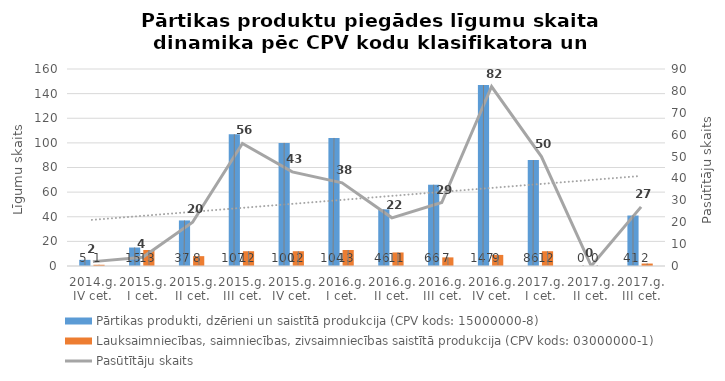
| Category | Pārtikas produkti, dzērieni un saistītā produkcija (CPV kods: 15000000-8) | Lauksaimniecības, saimniecības, zivsaimniecības saistītā produkcija (CPV kods: 03000000-1) |
|---|---|---|
| 2014.g. IV cet. | 5 | 1 |
| 2015.g. I cet. | 15 | 13 |
| 2015.g. II cet. | 37 | 8 |
| 2015.g. III cet. | 107 | 12 |
| 2015.g. IV cet. | 100 | 12 |
| 2016.g. I cet. | 104 | 13 |
| 2016.g. II cet. | 46 | 11 |
| 2016.g. III cet. | 66 | 7 |
| 2016.g. IV cet. | 147 | 9 |
| 2017.g. I cet. | 86 | 12 |
| 2017.g. II cet. | 0 | 0 |
| 2017.g. III cet. | 41 | 2 |